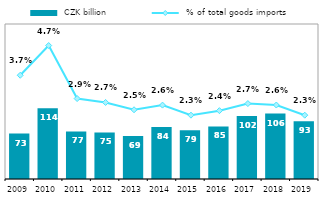
| Category |  CZK billion |
|---|---|
| 2009.0 | 73.223 |
| 2010.0 | 114.187 |
| 2011.0 | 76.71 |
| 2012.0 | 75.15 |
| 2013.0 | 69.362 |
| 2014.0 | 83.906 |
| 2015.0 | 78.75 |
| 2016.0 | 84.734 |
| 2017.0 | 101.739 |
| 2018.0 | 105.611 |
| 2019.0 | 93.257 |